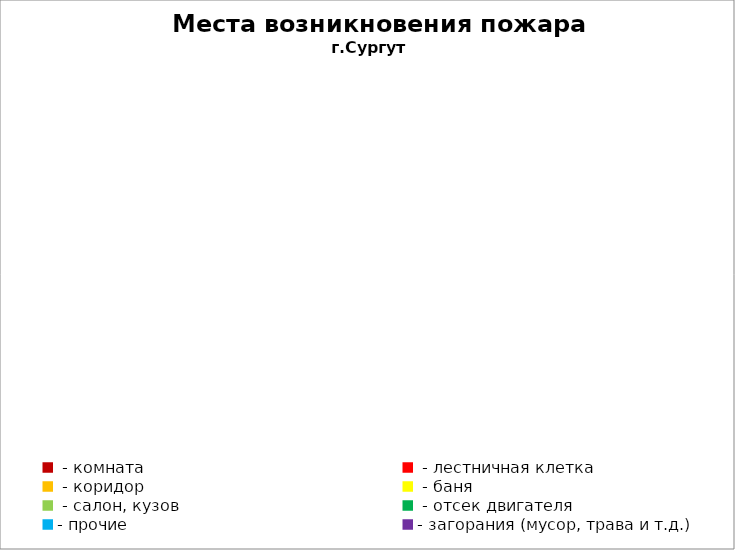
| Category | Места возникновения пожара |
|---|---|
|  - комната | 50 |
|  - лестничная клетка | 22 |
|  - коридор | 9 |
|  - баня | 28 |
|  - салон, кузов | 10 |
|  - отсек двигателя | 30 |
| - прочие | 117 |
| - загорания (мусор, трава и т.д.)  | 161 |